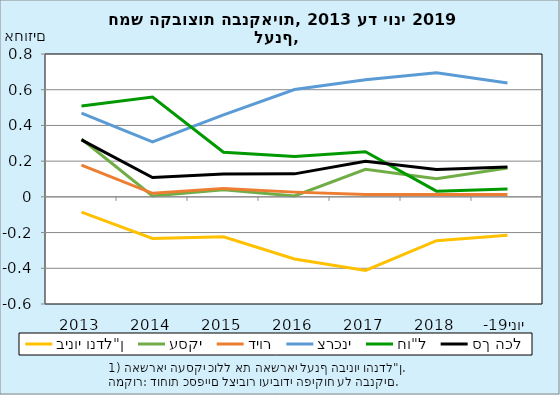
| Category | בינוי ונדל"ן | עסקי | דיור | צרכני | חו"ל | סך הכל |
|---|---|---|---|---|---|---|
| 2013 | -0.086 | 0.324 | 0.178 | 0.469 | 0.508 | 0.319 |
| 2014 | -0.233 | 0.005 | 0.02 | 0.307 | 0.559 | 0.109 |
| 2015 | -0.223 | 0.039 | 0.047 | 0.459 | 0.25 | 0.128 |
| 2016 | -0.348 | 0.005 | 0.026 | 0.601 | 0.227 | 0.129 |
| 2017 | -0.412 | 0.155 | 0.013 | 0.656 | 0.253 | 0.199 |
| 2018 | -0.246 | 0.101 | 0.013 | 0.695 | 0.032 | 0.153 |
| יוני-19 | -0.215 | 0.162 | 0.013 | 0.638 | 0.044 | 0.168 |